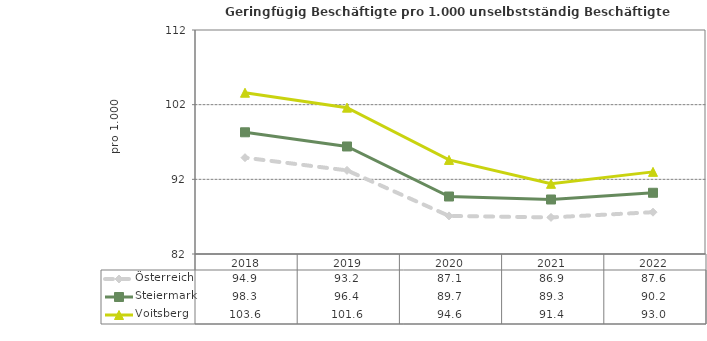
| Category | Österreich | Steiermark | Voitsberg |
|---|---|---|---|
| 2022.0 | 87.6 | 90.2 | 93 |
| 2021.0 | 86.9 | 89.3 | 91.4 |
| 2020.0 | 87.1 | 89.7 | 94.6 |
| 2019.0 | 93.2 | 96.4 | 101.6 |
| 2018.0 | 94.9 | 98.3 | 103.6 |